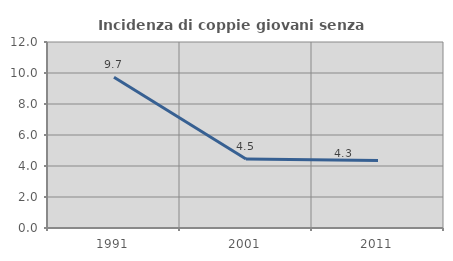
| Category | Incidenza di coppie giovani senza figli |
|---|---|
| 1991.0 | 9.73 |
| 2001.0 | 4.451 |
| 2011.0 | 4.348 |